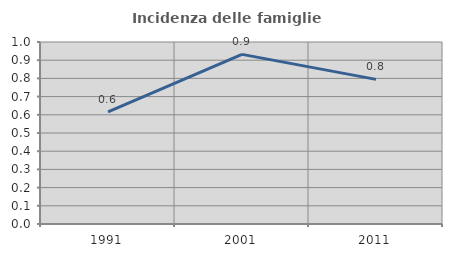
| Category | Incidenza delle famiglie numerose |
|---|---|
| 1991.0 | 0.616 |
| 2001.0 | 0.932 |
| 2011.0 | 0.795 |